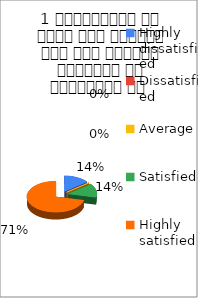
| Category | 1 व्याख्यान से रूचि में वृद्धि हुई एवं शिक्षण जानकारी से परिपूर्ण था  |
|---|---|
| Highly dissatisfied | 1 |
| Dissatisfied | 0 |
| Average | 0 |
| Satisfied | 1 |
| Highly satisfied | 5 |